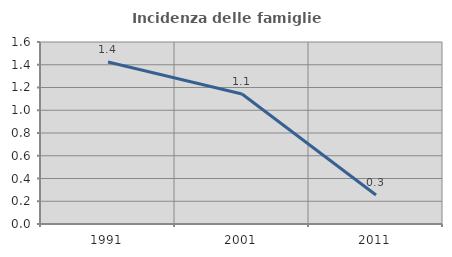
| Category | Incidenza delle famiglie numerose |
|---|---|
| 1991.0 | 1.423 |
| 2001.0 | 1.143 |
| 2011.0 | 0.254 |